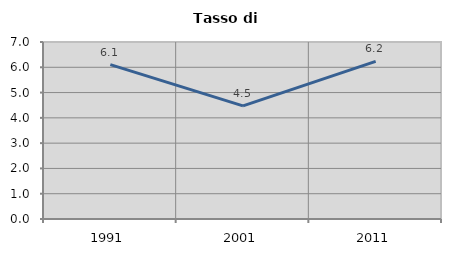
| Category | Tasso di disoccupazione   |
|---|---|
| 1991.0 | 6.103 |
| 2001.0 | 4.476 |
| 2011.0 | 6.236 |